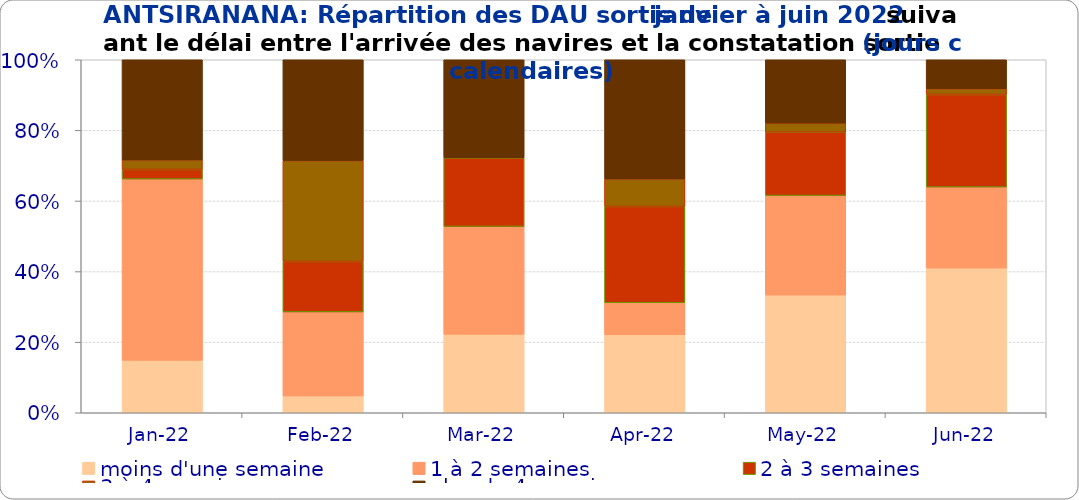
| Category | moins d'une semaine | 1 à 2 semaines | 2 à 3 semaines | 3 à 4 semaines | plus de 4 semaines |
|---|---|---|---|---|---|
| 2022-01-01 | 0.149 | 0.514 | 0.027 | 0.027 | 0.284 |
| 2022-02-01 | 0.048 | 0.238 | 0.143 | 0.286 | 0.286 |
| 2022-03-01 | 0.222 | 0.306 | 0.194 | 0 | 0.278 |
| 2022-04-01 | 0.221 | 0.091 | 0.273 | 0.078 | 0.338 |
| 2022-05-01 | 0.333 | 0.282 | 0.179 | 0.026 | 0.179 |
| 2022-06-01 | 0.41 | 0.23 | 0.262 | 0.016 | 0.082 |